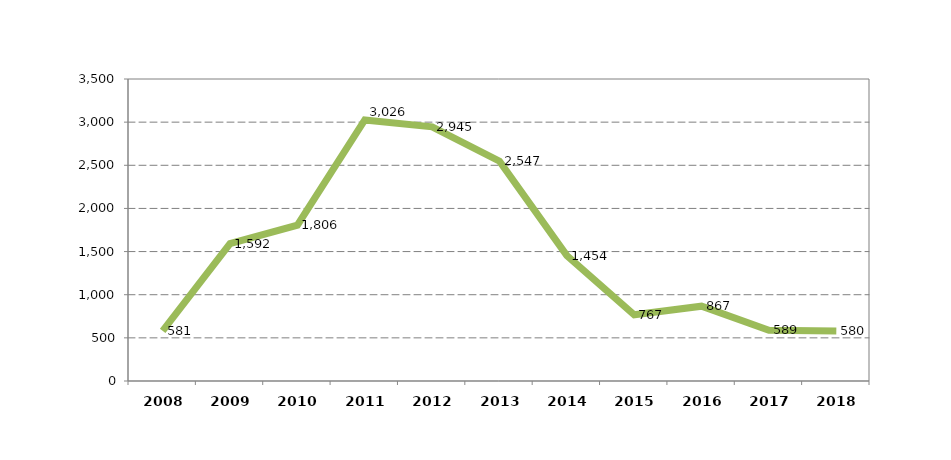
| Category | Series 0 |
|---|---|
| 2008.0 | 581 |
| 2009.0 | 1592 |
| 2010.0 | 1806 |
| 2011.0 | 3026 |
| 2012.0 | 2945 |
| 2013.0 | 2547 |
| 2014.0 | 1454 |
| 2015.0 | 767 |
| 2016.0 | 867 |
| 2017.0 | 589 |
| 2018.0 | 580 |